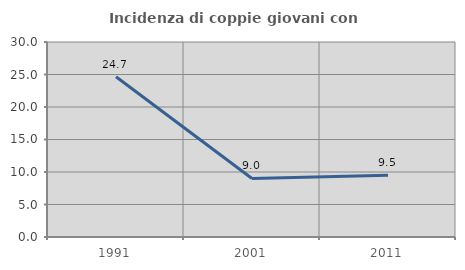
| Category | Incidenza di coppie giovani con figli |
|---|---|
| 1991.0 | 24.664 |
| 2001.0 | 9.009 |
| 2011.0 | 9.483 |